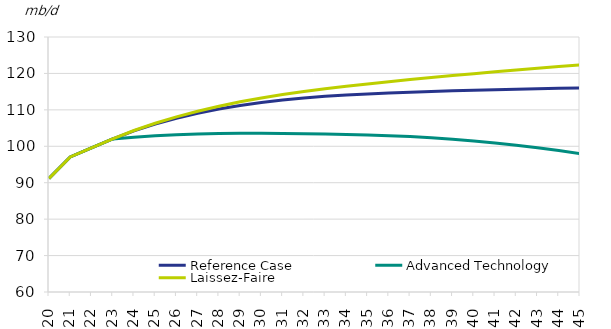
| Category | Reference Case | Advanced Technology | Laissez-Faire |
|---|---|---|---|
| 2020.0 | 91.19 | 91.19 | 91.19 |
| 2021.0 | 97.082 | 97.082 | 97.082 |
| 2022.0 | 99.569 | 99.569 | 99.569 |
| 2023.0 | 102.006 | 102.006 | 102.006 |
| 2024.0 | 104.252 | 102.508 | 104.329 |
| 2025.0 | 106.127 | 102.908 | 106.316 |
| 2026.0 | 107.69 | 103.197 | 108.062 |
| 2027.0 | 109.049 | 103.403 | 109.619 |
| 2028.0 | 110.21 | 103.514 | 110.995 |
| 2029.0 | 111.197 | 103.564 | 112.201 |
| 2030.0 | 112.019 | 103.564 | 113.253 |
| 2031.0 | 112.703 | 103.514 | 114.188 |
| 2032.0 | 113.259 | 103.441 | 115.03 |
| 2033.0 | 113.706 | 103.345 | 115.797 |
| 2034.0 | 114.072 | 103.229 | 116.486 |
| 2035.0 | 114.369 | 103.088 | 117.123 |
| 2036.0 | 114.633 | 102.899 | 117.732 |
| 2037.0 | 114.863 | 102.655 | 118.312 |
| 2038.0 | 115.06 | 102.339 | 118.867 |
| 2039.0 | 115.231 | 101.942 | 119.404 |
| 2040.0 | 115.389 | 101.468 | 119.928 |
| 2041.0 | 115.533 | 100.92 | 120.445 |
| 2042.0 | 115.667 | 100.299 | 120.945 |
| 2043.0 | 115.791 | 99.601 | 121.426 |
| 2044.0 | 115.908 | 98.833 | 121.9 |
| 2045.0 | 116.019 | 97.991 | 122.363 |